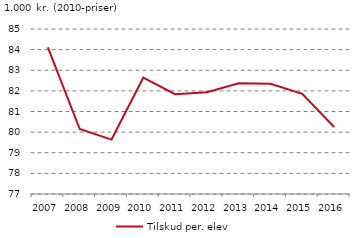
| Category | Tilskud per. elev |
|---|---|
| 2007.0 | 84.114 |
| 2008.0 | 80.151 |
| 2009.0 | 79.639 |
| 2010.0 | 82.648 |
| 2011.0 | 81.837 |
| 2012.0 | 81.936 |
| 2013.0 | 82.365 |
| 2014.0 | 82.349 |
| 2015.0 | 81.853 |
| 2016.0 | 80.251 |